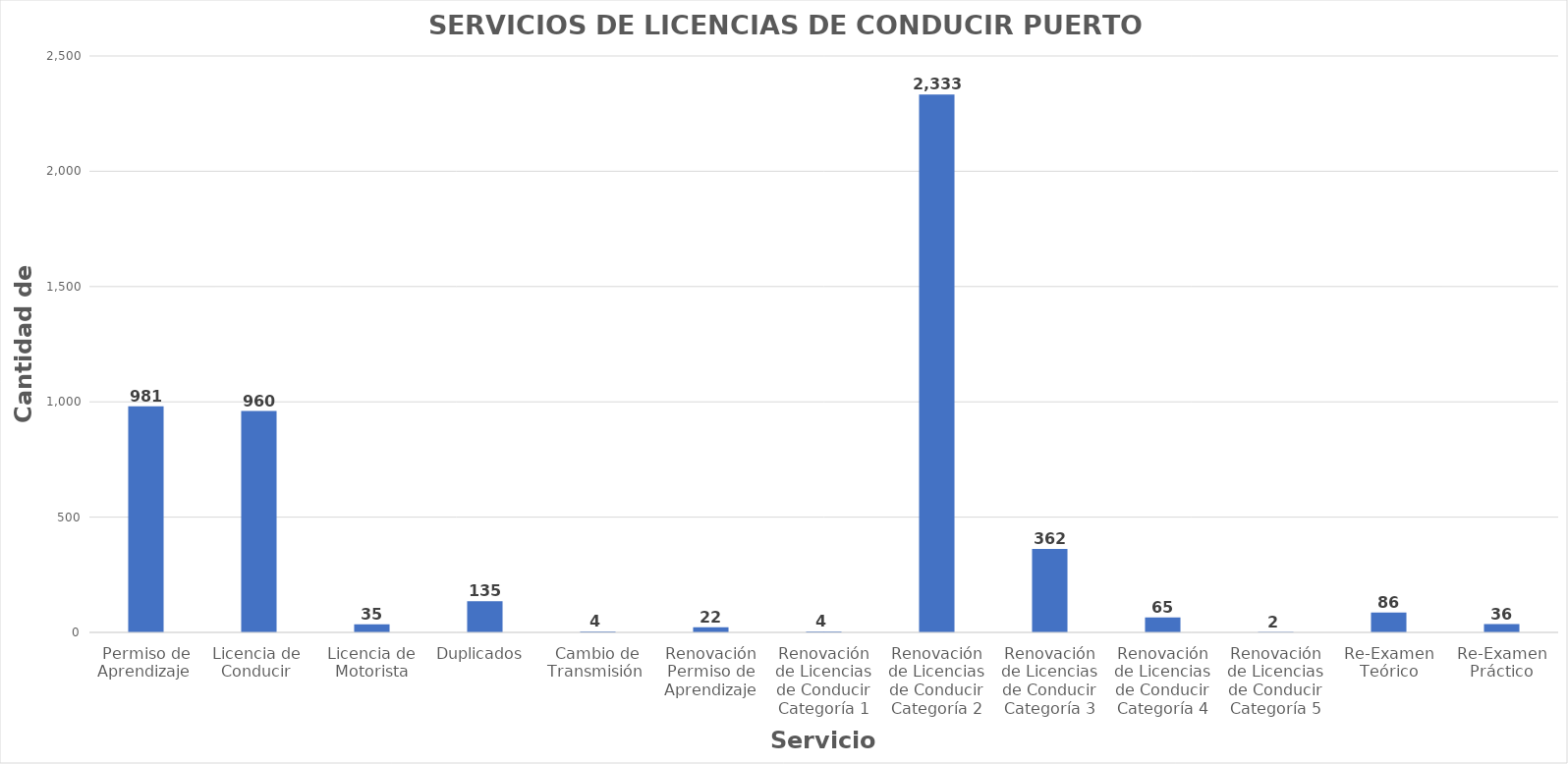
| Category | Series 0 |
|---|---|
| Permiso de Aprendizaje  | 981 |
| Licencia de  Conducir  | 960 |
| Licencia de Motorista | 35 |
| Duplicados  | 135 |
| Cambio de Transmisión  | 4 |
| Renovación Permiso de Aprendizaje | 22 |
| Renovación de Licencias de Conducir Categoría 1 | 4 |
| Renovación de Licencias de Conducir Categoría 2 | 2333 |
| Renovación de Licencias de Conducir Categoría 3 | 362 |
| Renovación de Licencias de Conducir Categoría 4 | 65 |
| Renovación de Licencias de Conducir Categoría 5 | 2 |
| Re-Examen Teórico | 86 |
| Re-Examen Práctico | 36 |